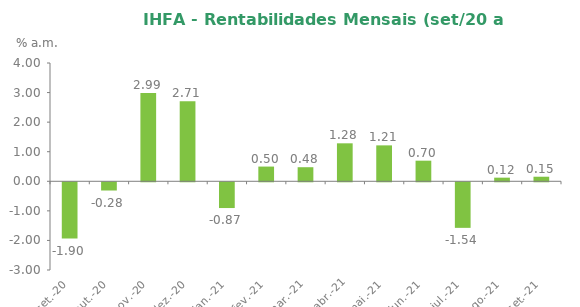
| Category | Series 0 |
|---|---|
| 2020-09-30 | -1.901 |
| 2020-10-31 | -0.278 |
| 2020-11-30 | 2.988 |
| 2020-12-31 | 2.707 |
| 2021-01-31 | -0.871 |
| 2021-02-28 | 0.498 |
| 2021-03-31 | 0.476 |
| 2021-04-30 | 1.284 |
| 2021-05-31 | 1.214 |
| 2021-06-30 | 0.697 |
| 2021-07-31 | -1.541 |
| 2021-08-31 | 0.123 |
| 2021-09-30 | 0.154 |